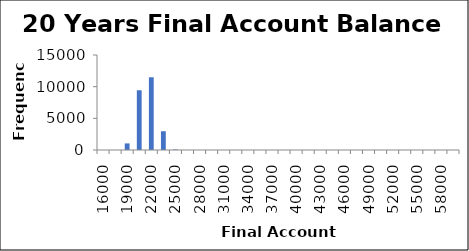
| Category | Frequency |
|---|---|
| 16000.0 | 0 |
| 17500.0 | 0 |
| 19000.0 | 1041 |
| 20500.0 | 9434 |
| 22000.0 | 11482 |
| 23500.0 | 2965 |
| 25000.0 | 78 |
| 26500.0 | 0 |
| 28000.0 | 0 |
| 29500.0 | 0 |
| 31000.0 | 0 |
| 32500.0 | 0 |
| 34000.0 | 0 |
| 35500.0 | 0 |
| 37000.0 | 0 |
| 38500.0 | 0 |
| 40000.0 | 0 |
| 41500.0 | 0 |
| 43000.0 | 0 |
| 44500.0 | 0 |
| 46000.0 | 0 |
| 47500.0 | 0 |
| 49000.0 | 0 |
| 50500.0 | 0 |
| 52000.0 | 0 |
| 53500.0 | 0 |
| 55000.0 | 0 |
| 56500.0 | 0 |
| 58000.0 | 0 |
| 59500.0 | 0 |